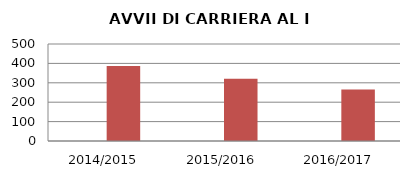
| Category | ANNO | NUMERO |
|---|---|---|
| 2014/2015 | 0 | 386 |
| 2015/2016 | 0 | 321 |
| 2016/2017 | 0 | 266 |